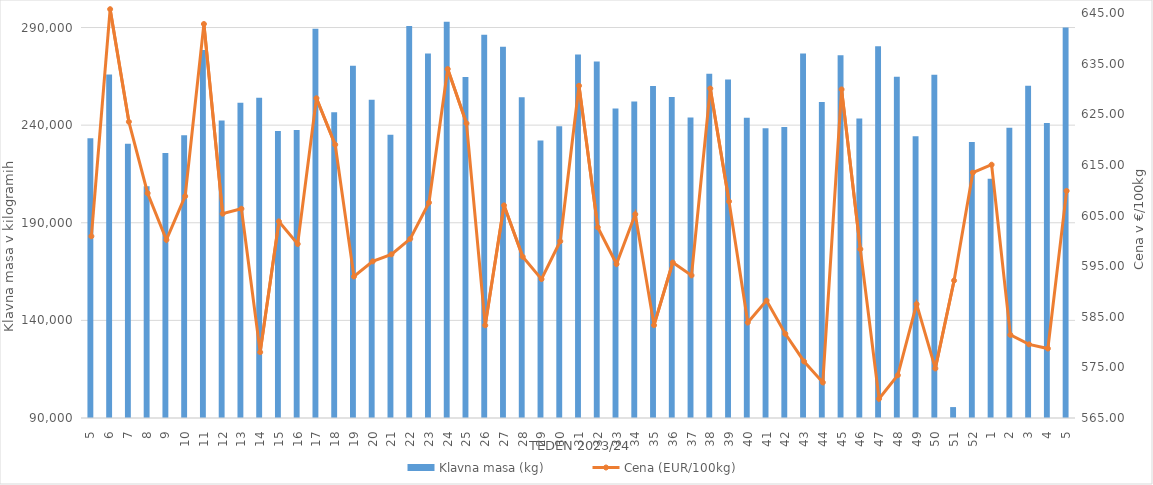
| Category | Klavna masa (kg) |
|---|---|
| 5.0 | 233306 |
| 6.0 | 265944 |
| 7.0 | 230531 |
| 8.0 | 208699 |
| 9.0 | 225712 |
| 10.0 | 234762 |
| 11.0 | 278467 |
| 12.0 | 242369 |
| 13.0 | 251507 |
| 14.0 | 254072 |
| 15.0 | 236964 |
| 16.0 | 237552 |
| 17.0 | 289400 |
| 18.0 | 246616 |
| 19.0 | 270374 |
| 20.0 | 252984 |
| 21.0 | 235060 |
| 22.0 | 290816 |
| 23.0 | 276702 |
| 24.0 | 292976 |
| 25.0 | 264669 |
| 26.0 | 286237 |
| 27.0 | 280112 |
| 28.0 | 254336 |
| 29.0 | 232178 |
| 30.0 | 239437 |
| 31.0 | 276163 |
| 32.0 | 272647 |
| 33.0 | 248536 |
| 34.0 | 252050 |
| 35.0 | 260110 |
| 36.0 | 254389 |
| 37.0 | 243933 |
| 38.0 | 266321 |
| 39.0 | 263346 |
| 40.0 | 243765 |
| 41.0 | 238404 |
| 42.0 | 239007 |
| 43.0 | 276684 |
| 44.0 | 251832 |
| 45.0 | 275816 |
| 46.0 | 243425 |
| 47.0 | 280350 |
| 48.0 | 264849 |
| 49.0 | 234308 |
| 50.0 | 265786 |
| 51.0 | 95590 |
| 52.0 | 231370 |
| 1.0 | 212581 |
| 2.0 | 238607 |
| 3.0 | 260140 |
| 4.0 | 241148 |
| 5.0 | 290049 |